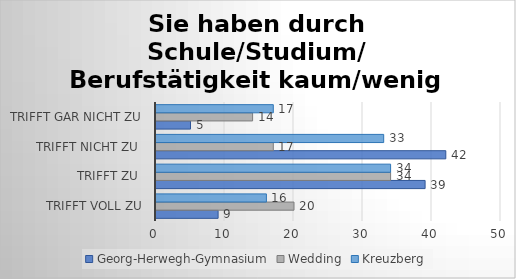
| Category | Georg-Herwegh-Gymnasium | Wedding | Kreuzberg |
|---|---|---|---|
| trifft voll zu | 9 | 20 | 16 |
| trifft zu  | 39 | 34 | 34 |
| trifft nicht zu  | 42 | 17 | 33 |
| trifft gar nicht zu | 5 | 14 | 17 |